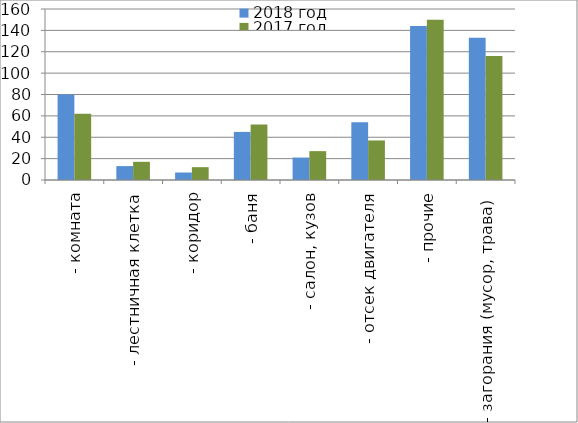
| Category | 2018 год | 2017 год |
|---|---|---|
|  - комната | 80 | 62 |
|  - лестничная клетка | 13 | 17 |
|  - коридор | 7 | 12 |
|  - баня | 45 | 52 |
|  - салон, кузов | 21 | 27 |
|  - отсек двигателя | 54 | 37 |
| - прочие | 144 | 150 |
| - загорания (мусор, трава)  | 133 | 116 |